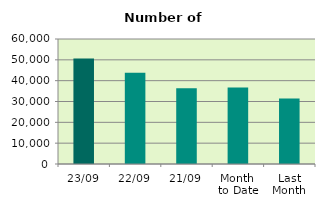
| Category | Series 0 |
|---|---|
| 23/09 | 50698 |
| 22/09 | 43842 |
| 21/09 | 36322 |
| Month 
to Date | 36666.353 |
| Last
Month | 31456 |